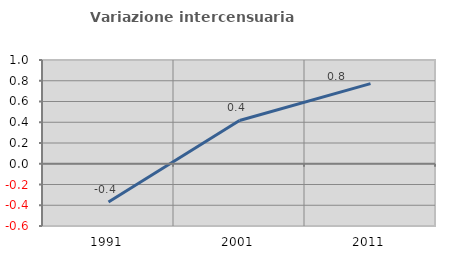
| Category | Variazione intercensuaria annua |
|---|---|
| 1991.0 | -0.368 |
| 2001.0 | 0.417 |
| 2011.0 | 0.772 |